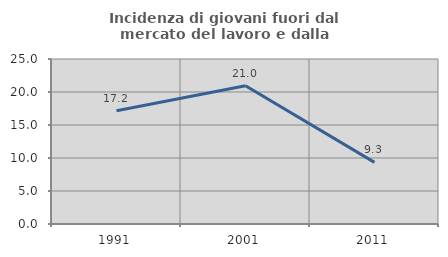
| Category | Incidenza di giovani fuori dal mercato del lavoro e dalla formazione  |
|---|---|
| 1991.0 | 17.161 |
| 2001.0 | 20.958 |
| 2011.0 | 9.339 |